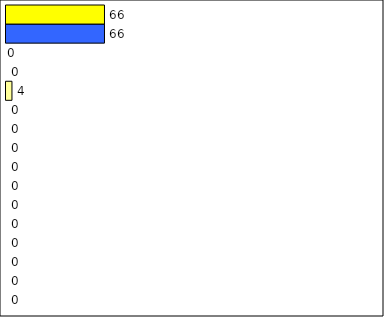
| Category | -2 | -1 | 0 | 1 | 2 | 3 | 4 | 5 | 6 | 7 | 8 | 9 | 10 | 11 | 12 | Perfect Round |
|---|---|---|---|---|---|---|---|---|---|---|---|---|---|---|---|---|
| 0 | 0 | 0 | 0 | 0 | 0 | 0 | 0 | 0 | 0 | 0 | 0 | 4 | 0 | 0 | 66 | 66 |